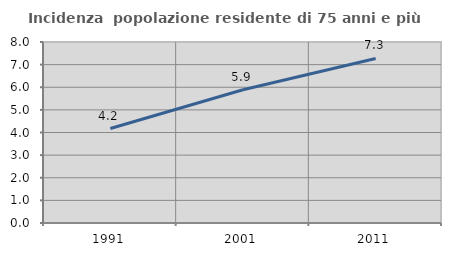
| Category | Incidenza  popolazione residente di 75 anni e più |
|---|---|
| 1991.0 | 4.175 |
| 2001.0 | 5.887 |
| 2011.0 | 7.274 |